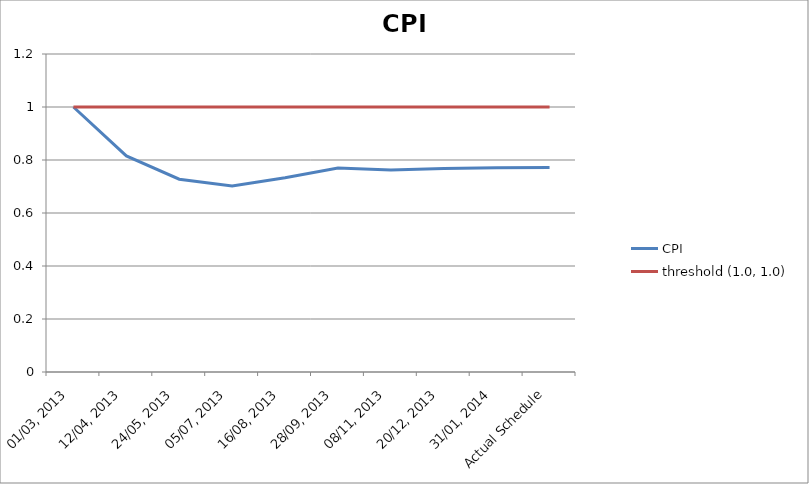
| Category | CPI | threshold (1.0, 1.0) |
|---|---|---|
| 01/03, 2013 | 1 | 1 |
| 12/04, 2013 | 0.815 | 1 |
| 24/05, 2013 | 0.728 | 1 |
| 05/07, 2013 | 0.702 | 1 |
| 16/08, 2013 | 0.733 | 1 |
| 28/09, 2013 | 0.77 | 1 |
| 08/11, 2013 | 0.763 | 1 |
| 20/12, 2013 | 0.767 | 1 |
| 31/01, 2014 | 0.771 | 1 |
| Actual Schedule | 0.772 | 1 |